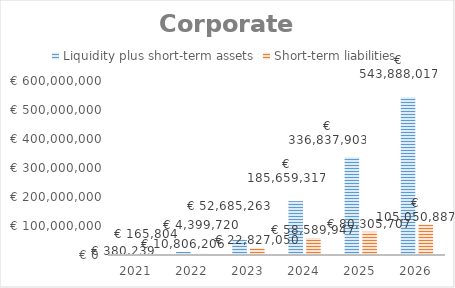
| Category | Liquidity plus short-term assets | Short-term liabilities |
|---|---|---|
| 2021.0 | 380238.85 | 165804.178 |
| 2022.0 | 10806206.48 | 4399720.267 |
| 2023.0 | 52685262.924 | 22827049.587 |
| 2024.0 | 185659317.033 | 58589946.506 |
| 2025.0 | 336837903.382 | 80305707.052 |
| 2026.0 | 543888016.915 | 105050886.701 |